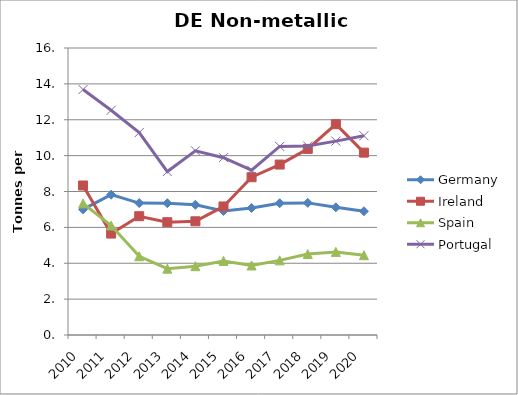
| Category | Germany | Ireland | Spain | Portugal |
|---|---|---|---|---|
| 2010 | 7.003 | 8.335 | 7.338 | 13.683 |
| 2011 | 7.823 | 5.655 | 6.104 | 12.527 |
| 2012 | 7.355 | 6.622 | 4.39 | 11.288 |
| 2013 | 7.348 | 6.288 | 3.696 | 9.111 |
| 2014 | 7.26 | 6.339 | 3.837 | 10.27 |
| 2015 | 6.914 | 7.167 | 4.129 | 9.886 |
| 2016 | 7.082 | 8.796 | 3.876 | 9.19 |
| 2017 | 7.345 | 9.502 | 4.161 | 10.514 |
| 2018 | 7.365 | 10.374 | 4.512 | 10.536 |
| 2019 | 7.117 | 11.753 | 4.633 | 10.808 |
| 2020 | 6.898 | 10.167 | 4.449 | 11.111 |